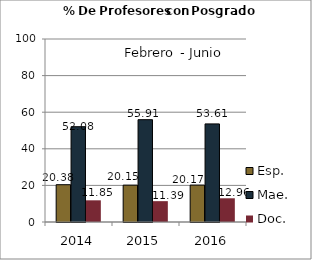
| Category | Esp. | Mae. | Doc. |
|---|---|---|---|
| 2014.0 | 20.38 | 52.08 | 11.85 |
| 2015.0 | 20.15 | 55.91 | 11.39 |
| 2016.0 | 20.17 | 53.61 | 12.96 |